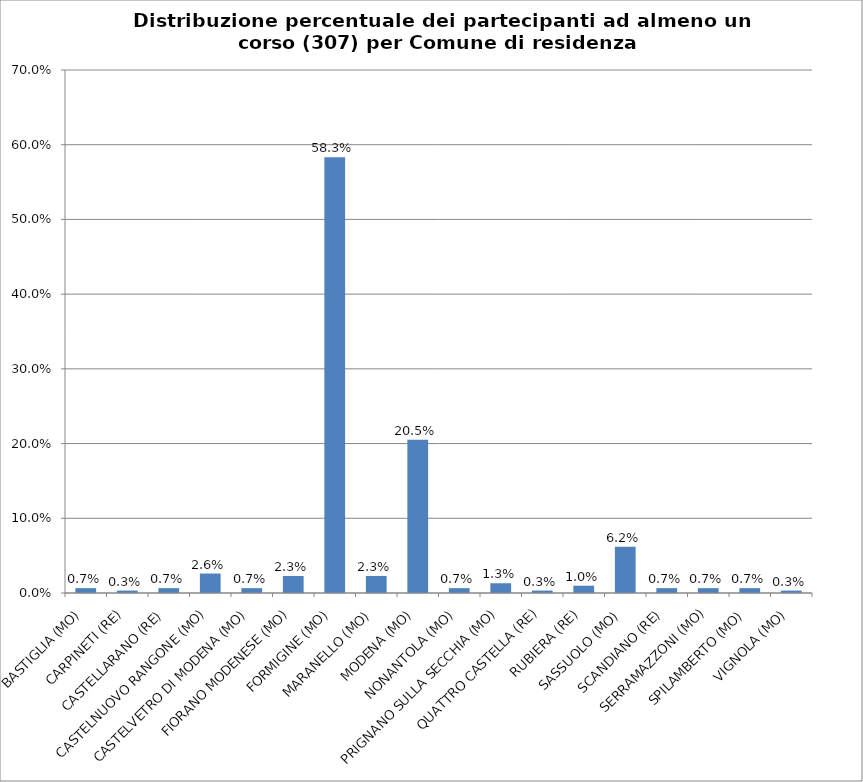
| Category | % Tesserati |
|---|---|
| BASTIGLIA (MO) | 0.007 |
| CARPINETI (RE) | 0.003 |
| CASTELLARANO (RE) | 0.007 |
| CASTELNUOVO RANGONE (MO) | 0.026 |
| CASTELVETRO DI MODENA (MO) | 0.007 |
| FIORANO MODENESE (MO) | 0.023 |
| FORMIGINE (MO) | 0.583 |
| MARANELLO (MO) | 0.023 |
| MODENA (MO) | 0.205 |
| NONANTOLA (MO) | 0.007 |
| PRIGNANO SULLA SECCHIA (MO) | 0.013 |
| QUATTRO CASTELLA (RE) | 0.003 |
| RUBIERA (RE) | 0.01 |
| SASSUOLO (MO) | 0.062 |
| SCANDIANO (RE) | 0.007 |
| SERRAMAZZONI (MO) | 0.007 |
| SPILAMBERTO (MO) | 0.007 |
| VIGNOLA (MO) | 0.003 |